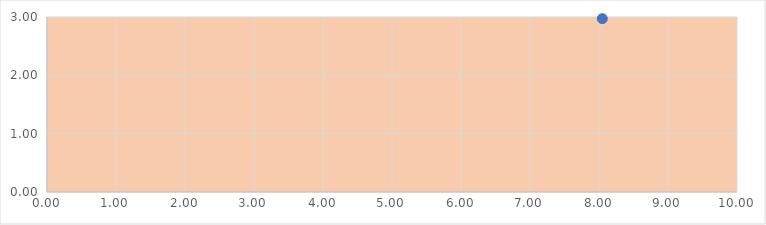
| Category | Series 0 |
|---|---|
| 8.04768593877536 | 2.972 |